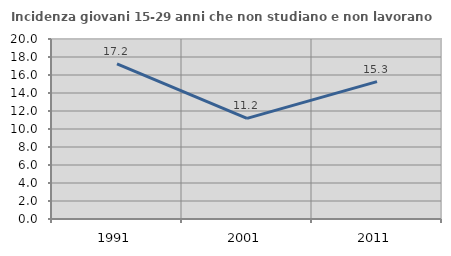
| Category | Incidenza giovani 15-29 anni che non studiano e non lavorano  |
|---|---|
| 1991.0 | 17.241 |
| 2001.0 | 11.176 |
| 2011.0 | 15.267 |